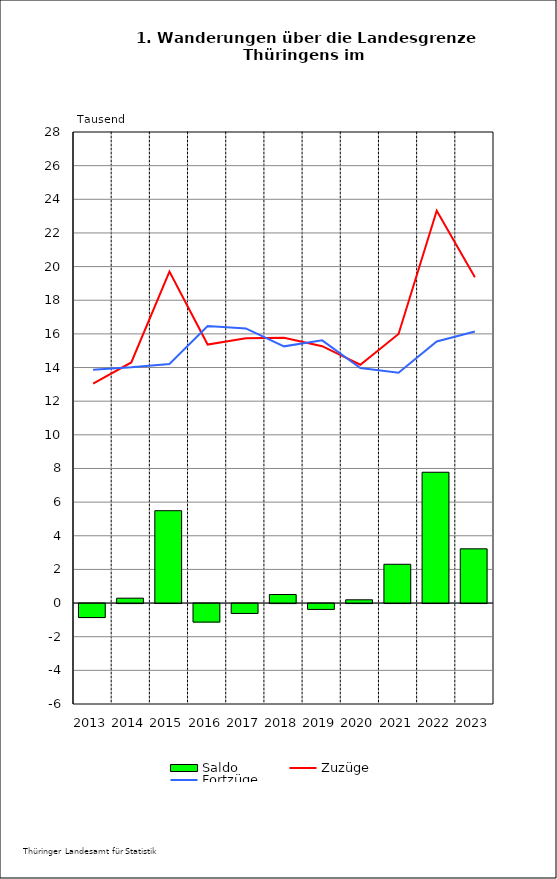
| Category | Saldo |
|---|---|
| 2013.0 | -0.832 |
| 2014.0 | 0.29 |
| 2015.0 | 5.49 |
| 2016.0 | -1.1 |
| 2017.0 | -0.587 |
| 2018.0 | 0.508 |
| 2019.0 | -0.349 |
| 2020.0 | 0.193 |
| 2021.0 | 2.305 |
| 2022.0 | 7.775 |
| 2023.0 | 3.223 |